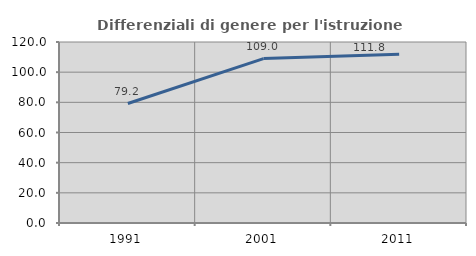
| Category | Differenziali di genere per l'istruzione superiore |
|---|---|
| 1991.0 | 79.206 |
| 2001.0 | 109.027 |
| 2011.0 | 111.835 |